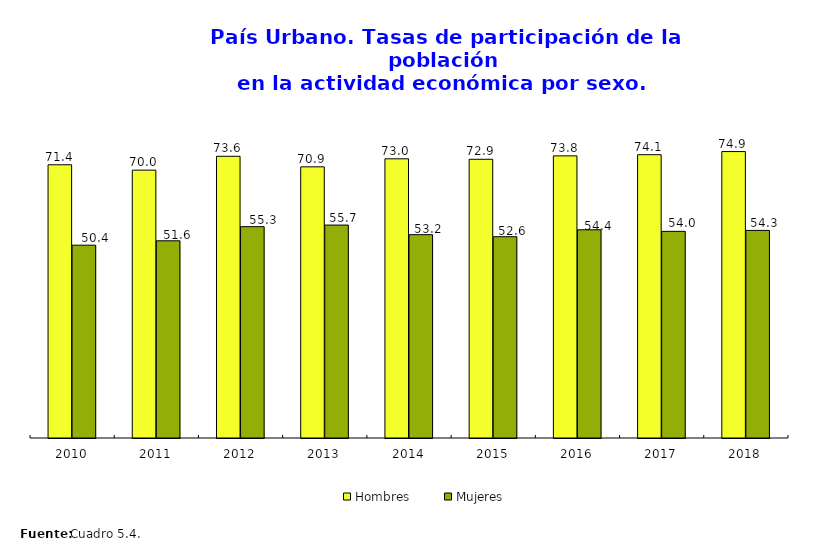
| Category | Hombres | Mujeres |
|---|---|---|
| 2010.0 | 71.431 | 50.41 |
| 2011.0 | 70.033 | 51.553 |
| 2012.0 | 73.649 | 55.252 |
| 2013.0 | 70.893 | 55.669 |
| 2014.0 | 72.993 | 53.161 |
| 2015.0 | 72.87 | 52.626 |
| 2016.0 | 73.762 | 54.434 |
| 2017.0 | 74.063 | 54.027 |
| 2018.0 | 74.883 | 54.269 |